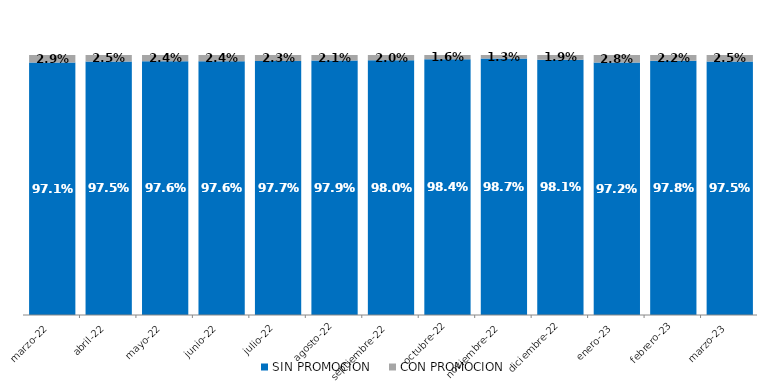
| Category | SIN PROMOCION   | CON PROMOCION   |
|---|---|---|
| 2022-03-01 | 0.971 | 0.029 |
| 2022-04-01 | 0.975 | 0.025 |
| 2022-05-01 | 0.976 | 0.024 |
| 2022-06-01 | 0.976 | 0.024 |
| 2022-07-01 | 0.977 | 0.023 |
| 2022-08-01 | 0.979 | 0.021 |
| 2022-09-01 | 0.98 | 0.02 |
| 2022-10-01 | 0.984 | 0.016 |
| 2022-11-01 | 0.987 | 0.013 |
| 2022-12-01 | 0.981 | 0.019 |
| 2023-01-01 | 0.972 | 0.028 |
| 2023-02-01 | 0.978 | 0.022 |
| 2023-03-01 | 0.975 | 0.025 |